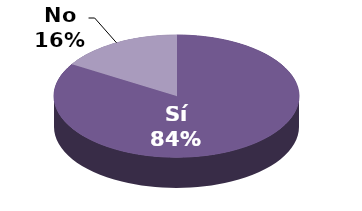
| Category | Series 1 |
|---|---|
| Sí | 36 |
| No | 7 |